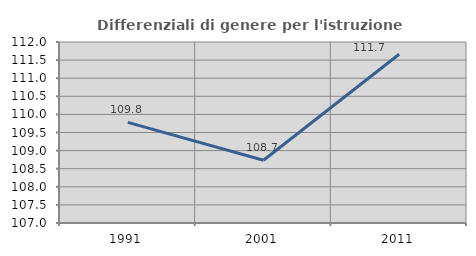
| Category | Differenziali di genere per l'istruzione superiore |
|---|---|
| 1991.0 | 109.781 |
| 2001.0 | 108.734 |
| 2011.0 | 111.662 |